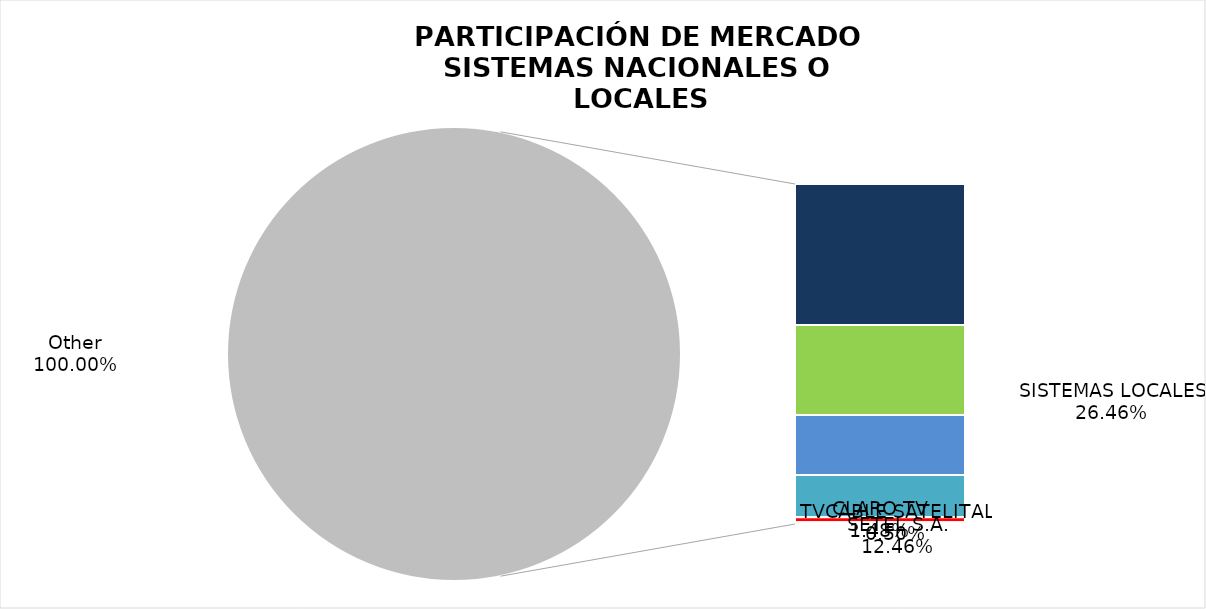
| Category | Series 0 |
|---|---|
| DIRECTV | 225998 |
| SISTEMAS LOCALES | 144050 |
| CNT TV | 95856 |
| SETEL S.A. | 67848 |
| CLARO TV | 8056 |
| TVCABLE SATELITAL | 2697 |